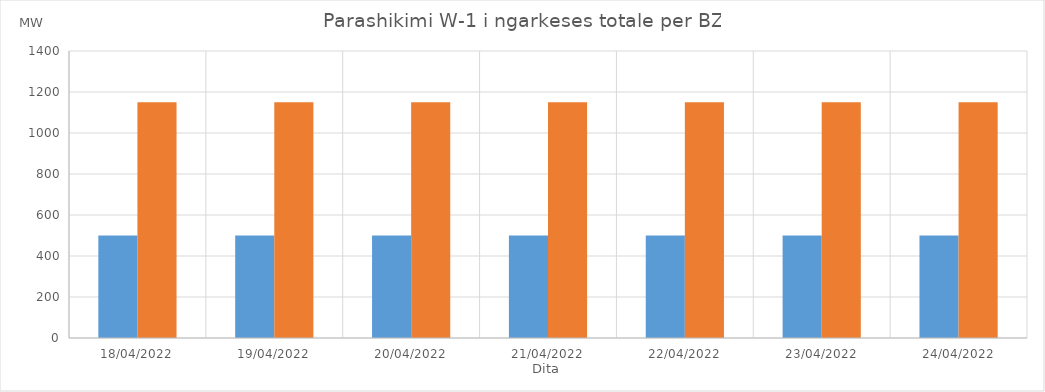
| Category | Min (MW) | Max (MW) |
|---|---|---|
| 18/04/2022 | 500 | 1150 |
| 19/04/2022 | 500 | 1150 |
| 20/04/2022 | 500 | 1150 |
| 21/04/2022 | 500 | 1150 |
| 22/04/2022 | 500 | 1150 |
| 23/04/2022 | 500 | 1150 |
| 24/04/2022 | 500 | 1150 |